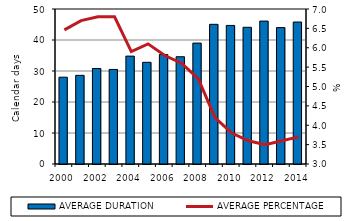
| Category | AVERAGE DURATION |
|---|---|
| 2000.0 | 28 |
| 2001.0 | 28.6 |
| 2002.0 | 30.8 |
| 2003.0 | 30.5 |
| 2004.0 | 34.8 |
| 2005.0 | 32.8 |
| 2006.0 | 35.3 |
| 2007.0 | 34.6 |
| 2008.0 | 39 |
| 2009.0 | 45.06 |
| 2010.0 | 44.7 |
| 2011.0 | 44.1 |
| 2012.0 | 46.1 |
| 2013.0 | 44 |
| 2014.0 | 45.8 |